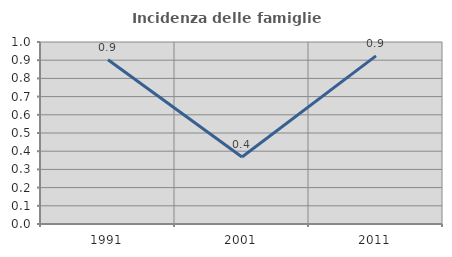
| Category | Incidenza delle famiglie numerose |
|---|---|
| 1991.0 | 0.903 |
| 2001.0 | 0.368 |
| 2011.0 | 0.923 |